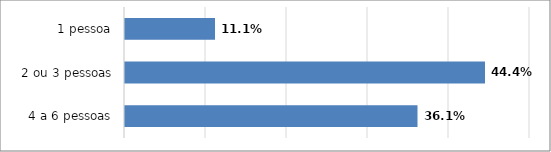
| Category | Series 0 |
|---|---|
| 4 a 6 pessoas | 0.361 |
| 2 ou 3 pessoas | 0.444 |
| 1 pessoa | 0.111 |